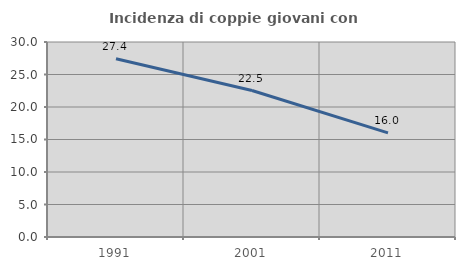
| Category | Incidenza di coppie giovani con figli |
|---|---|
| 1991.0 | 27.431 |
| 2001.0 | 22.534 |
| 2011.0 | 16.024 |